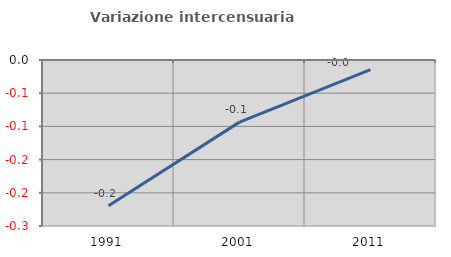
| Category | Variazione intercensuaria annua |
|---|---|
| 1991.0 | -0.22 |
| 2001.0 | -0.094 |
| 2011.0 | -0.014 |